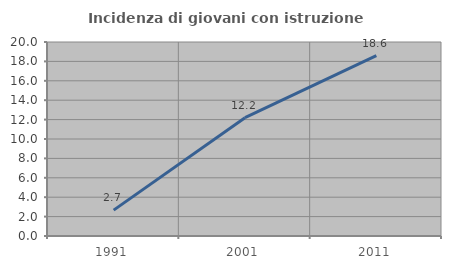
| Category | Incidenza di giovani con istruzione universitaria |
|---|---|
| 1991.0 | 2.667 |
| 2001.0 | 12.195 |
| 2011.0 | 18.605 |